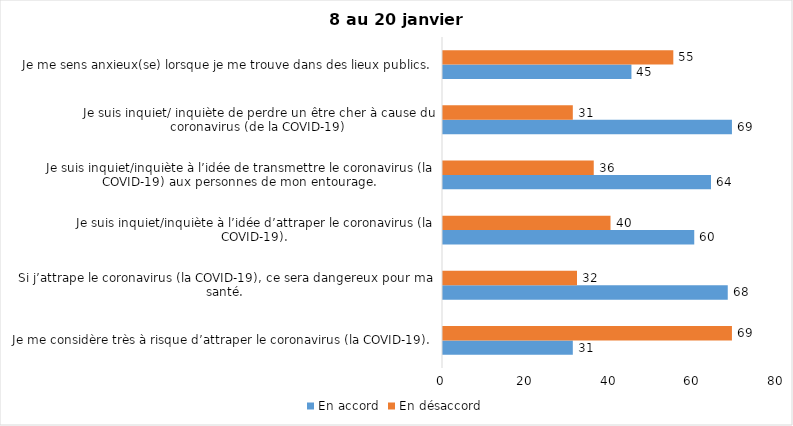
| Category | En accord | En désaccord |
|---|---|---|
| Je me considère très à risque d’attraper le coronavirus (la COVID-19). | 31 | 69 |
| Si j’attrape le coronavirus (la COVID-19), ce sera dangereux pour ma santé. | 68 | 32 |
| Je suis inquiet/inquiète à l’idée d’attraper le coronavirus (la COVID-19). | 60 | 40 |
| Je suis inquiet/inquiète à l’idée de transmettre le coronavirus (la COVID-19) aux personnes de mon entourage. | 64 | 36 |
| Je suis inquiet/ inquiète de perdre un être cher à cause du coronavirus (de la COVID-19) | 69 | 31 |
| Je me sens anxieux(se) lorsque je me trouve dans des lieux publics. | 45 | 55 |